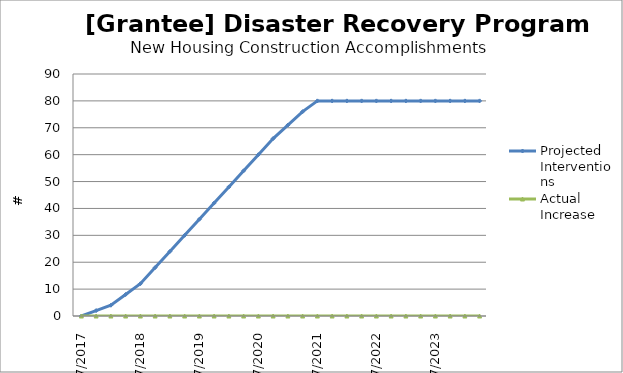
| Category | Projected Interventions | Actual Increase |
|---|---|---|
| 7/2017 | 0 | 0 |
| 10/2017 | 2 | 0 |
| 1/2018 | 4 | 0 |
| 4/2018 | 8 | 0 |
| 7/2018 | 12 | 0 |
| 10/2018 | 18 | 0 |
| 1/2019 | 24 | 0 |
| 4/2019 | 30 | 0 |
| 7/2019 | 36 | 0 |
| 10/2019 | 42 | 0 |
| 1/2020 | 48 | 0 |
| 4/2020 | 54 | 0 |
| 7/2020 | 60 | 0 |
| 10/2020 | 66 | 0 |
| 1/2021 | 71 | 0 |
| 4/2021 | 76 | 0 |
| 7/2021 | 80 | 0 |
| 10/2021 | 80 | 0 |
| 1/2022 | 80 | 0 |
| 4/2022 | 80 | 0 |
| 7/2022 | 80 | 0 |
| 10/2022 | 80 | 0 |
| 1/2023 | 80 | 0 |
| 4/2023 | 80 | 0 |
| 7/2023 | 80 | 0 |
| 10/2023 | 80 | 0 |
| 1/2024 | 80 | 0 |
| 4/2024 | 80 | 0 |